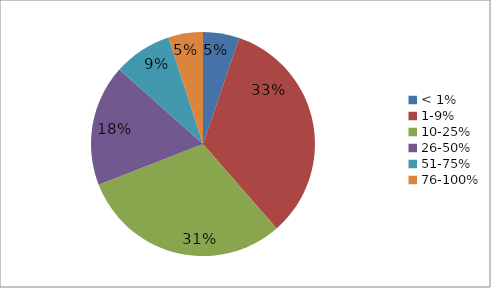
| Category | Series 0 |
|---|---|
| < 1% | 2053 |
| 1-9% | 13033 |
| 10-25% | 11926 |
| 26-50% | 6845 |
| 51-75% | 3297 |
| 76-100% | 1950 |